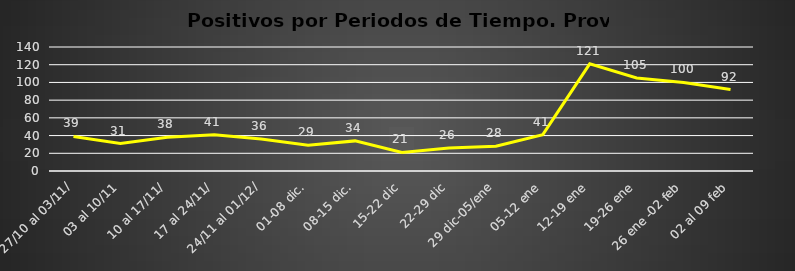
| Category | Prov. Islay |
|---|---|
| 27/10 al 03/11/ | 39 |
| 03 al 10/11 | 31 |
| 10 al 17/11/ | 38 |
|  17 al 24/11/ | 41 |
|  24/11 al 01/12/ | 36 |
| 01-08 dic. | 29 |
| 08-15 dic. | 34 |
| 15-22 dic | 21 |
| 22-29 dic | 26 |
| 29 dic-05/ene | 28 |
| 05-12 ene | 41 |
| 12-19 ene | 121 |
| 19-26 ene | 105 |
| 26 ene -02 feb | 100 |
| 02 al 09 feb | 92 |